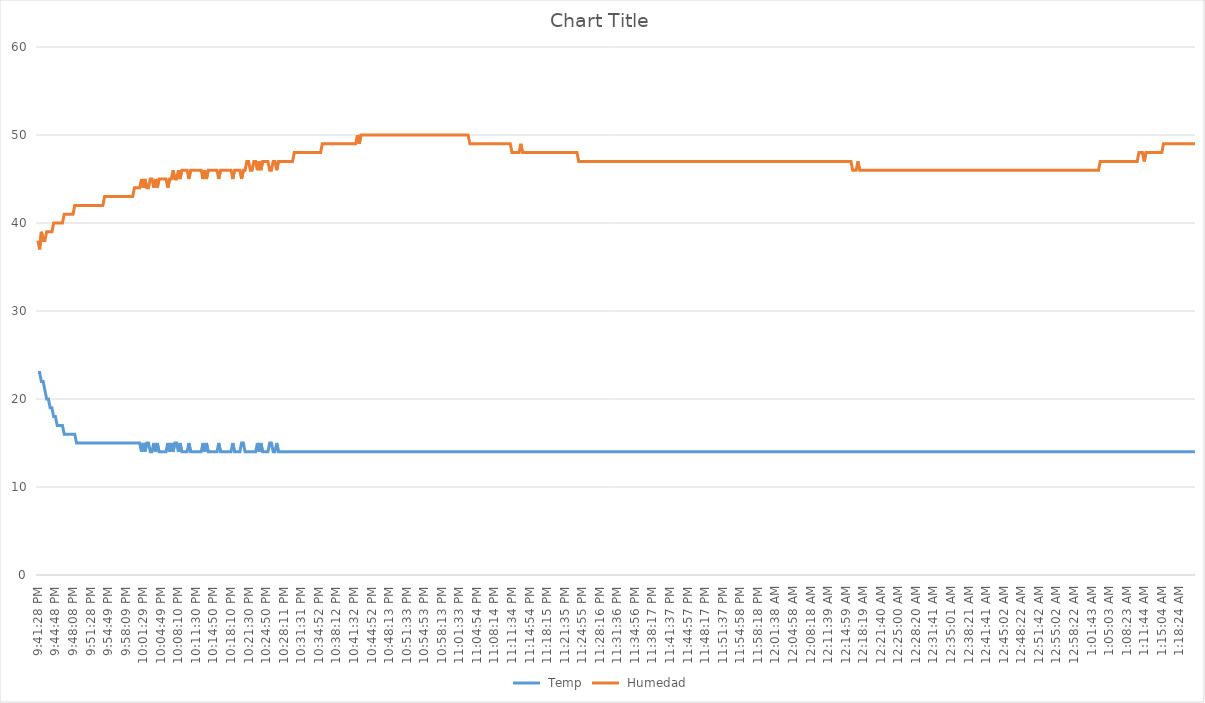
| Category |  Temp |  Humedad |
|---|---|---|
| 2015-11-24 21:41:28 | 23 | 38 |
| 2015-11-24 21:41:48 | 23 | 37 |
| 2015-11-24 21:42:08 | 22 | 39 |
| 2015-11-24 21:42:28 | 22 | 38 |
| 2015-11-24 21:42:48 | 21 | 38 |
| 2015-11-24 21:43:08 | 20 | 39 |
| 2015-11-24 21:43:28 | 20 | 39 |
| 2015-11-24 21:43:48 | 19 | 39 |
| 2015-11-24 21:44:08 | 19 | 39 |
| 2015-11-24 21:44:28 | 18 | 40 |
| 2015-11-24 21:44:48 | 18 | 40 |
| 2015-11-24 21:45:08 | 17 | 40 |
| 2015-11-24 21:45:28 | 17 | 40 |
| 2015-11-24 21:45:48 | 17 | 40 |
| 2015-11-24 21:46:08 | 17 | 40 |
| 2015-11-24 21:46:28 | 16 | 41 |
| 2015-11-24 21:46:48 | 16 | 41 |
| 2015-11-24 21:47:08 | 16 | 41 |
| 2015-11-24 21:47:28 | 16 | 41 |
| 2015-11-24 21:47:48 | 16 | 41 |
| 2015-11-24 21:48:08 | 16 | 41 |
| 2015-11-24 21:48:28 | 16 | 42 |
| 2015-11-24 21:48:48 | 15 | 42 |
| 2015-11-24 21:49:08 | 15 | 42 |
| 2015-11-24 21:49:28 | 15 | 42 |
| 2015-11-24 21:49:48 | 15 | 42 |
| 2015-11-24 21:50:08 | 15 | 42 |
| 2015-11-24 21:50:28 | 15 | 42 |
| 2015-11-24 21:50:48 | 15 | 42 |
| 2015-11-24 21:51:08 | 15 | 42 |
| 2015-11-24 21:51:28 | 15 | 42 |
| 2015-11-24 21:51:48 | 15 | 42 |
| 2015-11-24 21:52:08 | 15 | 42 |
| 2015-11-24 21:52:28 | 15 | 42 |
| 2015-11-24 21:52:48 | 15 | 42 |
| 2015-11-24 21:53:08 | 15 | 42 |
| 2015-11-24 21:53:28 | 15 | 42 |
| 2015-11-24 21:53:48 | 15 | 42 |
| 2015-11-24 21:54:08 | 15 | 43 |
| 2015-11-24 21:54:28 | 15 | 43 |
| 2015-11-24 21:54:49 | 15 | 43 |
| 2015-11-24 21:55:09 | 15 | 43 |
| 2015-11-24 21:55:29 | 15 | 43 |
| 2015-11-24 21:55:49 | 15 | 43 |
| 2015-11-24 21:56:09 | 15 | 43 |
| 2015-11-24 21:56:29 | 15 | 43 |
| 2015-11-24 21:56:49 | 15 | 43 |
| 2015-11-24 21:57:09 | 15 | 43 |
| 2015-11-24 21:57:29 | 15 | 43 |
| 2015-11-24 21:57:49 | 15 | 43 |
| 2015-11-24 21:58:09 | 15 | 43 |
| 2015-11-24 21:58:29 | 15 | 43 |
| 2015-11-24 21:58:49 | 15 | 43 |
| 2015-11-24 21:59:09 | 15 | 43 |
| 2015-11-24 21:59:29 | 15 | 43 |
| 2015-11-24 21:59:49 | 15 | 44 |
| 2015-11-24 22:00:09 | 15 | 44 |
| 2015-11-24 22:00:29 | 15 | 44 |
| 2015-11-24 22:00:49 | 15 | 44 |
| 2015-11-24 22:01:09 | 14 | 45 |
| 2015-11-24 22:01:29 | 15 | 44 |
| 2015-11-24 22:01:49 | 14 | 45 |
| 2015-11-24 22:02:09 | 15 | 44 |
| 2015-11-24 22:02:29 | 15 | 44 |
| 2015-11-24 22:02:49 | 14 | 45 |
| 2015-11-24 22:03:09 | 14 | 45 |
| 2015-11-24 22:03:29 | 15 | 44 |
| 2015-11-24 22:03:49 | 14 | 45 |
| 2015-11-24 22:04:09 | 15 | 44 |
| 2015-11-24 22:04:29 | 14 | 45 |
| 2015-11-24 22:04:49 | 14 | 45 |
| 2015-11-24 22:05:09 | 14 | 45 |
| 2015-11-24 22:05:29 | 14 | 45 |
| 2015-11-24 22:05:49 | 14 | 45 |
| 2015-11-24 22:06:09 | 15 | 44 |
| 2015-11-24 22:06:29 | 14 | 45 |
| 2015-11-24 22:06:49 | 15 | 45 |
| 2015-11-24 22:07:09 | 14 | 46 |
| 2015-11-24 22:07:30 | 15 | 45 |
| 2015-11-24 22:07:50 | 15 | 45 |
| 2015-11-24 22:08:10 | 14 | 46 |
| 2015-11-24 22:08:30 | 15 | 45 |
| 2015-11-24 22:08:50 | 14 | 46 |
| 2015-11-24 22:09:10 | 14 | 46 |
| 2015-11-24 22:09:30 | 14 | 46 |
| 2015-11-24 22:09:50 | 14 | 46 |
| 2015-11-24 22:10:10 | 15 | 45 |
| 2015-11-24 22:10:30 | 14 | 46 |
| 2015-11-24 22:10:50 | 14 | 46 |
| 2015-11-24 22:11:10 | 14 | 46 |
| 2015-11-24 22:11:30 | 14 | 46 |
| 2015-11-24 22:11:50 | 14 | 46 |
| 2015-11-24 22:12:10 | 14 | 46 |
| 2015-11-24 22:12:30 | 14 | 46 |
| 2015-11-24 22:12:50 | 15 | 45 |
| 2015-11-24 22:13:10 | 14 | 46 |
| 2015-11-24 22:13:30 | 15 | 45 |
| 2015-11-24 22:13:50 | 14 | 46 |
| 2015-11-24 22:14:10 | 14 | 46 |
| 2015-11-24 22:14:30 | 14 | 46 |
| 2015-11-24 22:14:50 | 14 | 46 |
| 2015-11-24 22:15:10 | 14 | 46 |
| 2015-11-24 22:15:30 | 14 | 46 |
| 2015-11-24 22:15:50 | 15 | 45 |
| 2015-11-24 22:16:10 | 14 | 46 |
| 2015-11-24 22:16:30 | 14 | 46 |
| 2015-11-24 22:16:50 | 14 | 46 |
| 2015-11-24 22:17:10 | 14 | 46 |
| 2015-11-24 22:17:30 | 14 | 46 |
| 2015-11-24 22:17:50 | 14 | 46 |
| 2015-11-24 22:18:10 | 14 | 46 |
| 2015-11-24 22:18:30 | 15 | 45 |
| 2015-11-24 22:18:50 | 14 | 46 |
| 2015-11-24 22:19:10 | 14 | 46 |
| 2015-11-24 22:19:30 | 14 | 46 |
| 2015-11-24 22:19:50 | 14 | 46 |
| 2015-11-24 22:20:10 | 15 | 45 |
| 2015-11-24 22:20:30 | 15 | 46 |
| 2015-11-24 22:20:50 | 14 | 46 |
| 2015-11-24 22:21:10 | 14 | 47 |
| 2015-11-24 22:21:30 | 14 | 47 |
| 2015-11-24 22:21:50 | 14 | 46 |
| 2015-11-24 22:22:10 | 14 | 46 |
| 2015-11-24 22:22:30 | 14 | 47 |
| 2015-11-24 22:22:50 | 14 | 47 |
| 2015-11-24 22:23:10 | 15 | 46 |
| 2015-11-24 22:23:30 | 14 | 47 |
| 2015-11-24 22:23:50 | 15 | 46 |
| 2015-11-24 22:24:10 | 14 | 47 |
| 2015-11-24 22:24:30 | 14 | 47 |
| 2015-11-24 22:24:50 | 14 | 47 |
| 2015-11-24 22:25:10 | 14 | 47 |
| 2015-11-24 22:25:31 | 15 | 46 |
| 2015-11-24 22:25:51 | 15 | 46 |
| 2015-11-24 22:26:11 | 14 | 47 |
| 2015-11-24 22:26:31 | 14 | 47 |
| 2015-11-24 22:26:51 | 15 | 46 |
| 2015-11-24 22:27:11 | 14 | 47 |
| 2015-11-24 22:27:31 | 14 | 47 |
| 2015-11-24 22:27:51 | 14 | 47 |
| 2015-11-24 22:28:11 | 14 | 47 |
| 2015-11-24 22:28:31 | 14 | 47 |
| 2015-11-24 22:28:51 | 14 | 47 |
| 2015-11-24 22:29:11 | 14 | 47 |
| 2015-11-24 22:29:31 | 14 | 47 |
| 2015-11-24 22:29:51 | 14 | 47 |
| 2015-11-24 22:30:11 | 14 | 48 |
| 2015-11-24 22:30:31 | 14 | 48 |
| 2015-11-24 22:30:51 | 14 | 48 |
| 2015-11-24 22:31:11 | 14 | 48 |
| 2015-11-24 22:31:31 | 14 | 48 |
| 2015-11-24 22:31:51 | 14 | 48 |
| 2015-11-24 22:32:11 | 14 | 48 |
| 2015-11-24 22:32:31 | 14 | 48 |
| 2015-11-24 22:32:51 | 14 | 48 |
| 2015-11-24 22:33:11 | 14 | 48 |
| 2015-11-24 22:33:31 | 14 | 48 |
| 2015-11-24 22:33:52 | 14 | 48 |
| 2015-11-24 22:34:12 | 14 | 48 |
| 2015-11-24 22:34:32 | 14 | 48 |
| 2015-11-24 22:34:52 | 14 | 48 |
| 2015-11-24 22:35:12 | 14 | 48 |
| 2015-11-24 22:35:32 | 14 | 49 |
| 2015-11-24 22:35:52 | 14 | 49 |
| 2015-11-24 22:36:12 | 14 | 49 |
| 2015-11-24 22:36:32 | 14 | 49 |
| 2015-11-24 22:36:52 | 14 | 49 |
| 2015-11-24 22:37:12 | 14 | 49 |
| 2015-11-24 22:37:32 | 14 | 49 |
| 2015-11-24 22:37:52 | 14 | 49 |
| 2015-11-24 22:38:12 | 14 | 49 |
| 2015-11-24 22:38:32 | 14 | 49 |
| 2015-11-24 22:38:52 | 14 | 49 |
| 2015-11-24 22:39:12 | 14 | 49 |
| 2015-11-24 22:39:32 | 14 | 49 |
| 2015-11-24 22:39:52 | 14 | 49 |
| 2015-11-24 22:40:12 | 14 | 49 |
| 2015-11-24 22:40:32 | 14 | 49 |
| 2015-11-24 22:40:52 | 14 | 49 |
| 2015-11-24 22:41:12 | 14 | 49 |
| 2015-11-24 22:41:32 | 14 | 49 |
| 2015-11-24 22:41:52 | 14 | 49 |
| 2015-11-24 22:42:12 | 14 | 50 |
| 2015-11-24 22:42:32 | 14 | 49 |
| 2015-11-24 22:42:52 | 14 | 50 |
| 2015-11-24 22:43:12 | 14 | 50 |
| 2015-11-24 22:43:32 | 14 | 50 |
| 2015-11-24 22:43:52 | 14 | 50 |
| 2015-11-24 22:44:12 | 14 | 50 |
| 2015-11-24 22:44:32 | 14 | 50 |
| 2015-11-24 22:44:52 | 14 | 50 |
| 2015-11-24 22:45:12 | 14 | 50 |
| 2015-11-24 22:45:32 | 14 | 50 |
| 2015-11-24 22:45:52 | 14 | 50 |
| 2015-11-24 22:46:12 | 14 | 50 |
| 2015-11-24 22:46:32 | 14 | 50 |
| 2015-11-24 22:46:52 | 14 | 50 |
| 2015-11-24 22:47:12 | 14 | 50 |
| 2015-11-24 22:47:33 | 14 | 50 |
| 2015-11-24 22:47:53 | 14 | 50 |
| 2015-11-24 22:48:13 | 14 | 50 |
| 2015-11-24 22:48:33 | 14 | 50 |
| 2015-11-24 22:48:53 | 14 | 50 |
| 2015-11-24 22:49:13 | 14 | 50 |
| 2015-11-24 22:49:33 | 14 | 50 |
| 2015-11-24 22:49:53 | 14 | 50 |
| 2015-11-24 22:50:13 | 14 | 50 |
| 2015-11-24 22:50:33 | 14 | 50 |
| 2015-11-24 22:50:53 | 14 | 50 |
| 2015-11-24 22:51:13 | 14 | 50 |
| 2015-11-24 22:51:33 | 14 | 50 |
| 2015-11-24 22:51:53 | 14 | 50 |
| 2015-11-24 22:52:13 | 14 | 50 |
| 2015-11-24 22:52:33 | 14 | 50 |
| 2015-11-24 22:52:53 | 14 | 50 |
| 2015-11-24 22:53:13 | 14 | 50 |
| 2015-11-24 22:53:33 | 14 | 50 |
| 2015-11-24 22:53:53 | 14 | 50 |
| 2015-11-24 22:54:13 | 14 | 50 |
| 2015-11-24 22:54:33 | 14 | 50 |
| 2015-11-24 22:54:53 | 14 | 50 |
| 2015-11-24 22:55:13 | 14 | 50 |
| 2015-11-24 22:55:33 | 14 | 50 |
| 2015-11-24 22:55:53 | 14 | 50 |
| 2015-11-24 22:56:13 | 14 | 50 |
| 2015-11-24 22:56:33 | 14 | 50 |
| 2015-11-24 22:56:53 | 14 | 50 |
| 2015-11-24 22:57:13 | 14 | 50 |
| 2015-11-24 22:57:33 | 14 | 50 |
| 2015-11-24 22:57:53 | 14 | 50 |
| 2015-11-24 22:58:13 | 14 | 50 |
| 2015-11-24 22:58:33 | 14 | 50 |
| 2015-11-24 22:58:53 | 14 | 50 |
| 2015-11-24 22:59:13 | 14 | 50 |
| 2015-11-24 22:59:33 | 14 | 50 |
| 2015-11-24 22:59:53 | 14 | 50 |
| 2015-11-24 23:00:13 | 14 | 50 |
| 2015-11-24 23:00:33 | 14 | 50 |
| 2015-11-24 23:00:53 | 14 | 50 |
| 2015-11-24 23:01:13 | 14 | 50 |
| 2015-11-24 23:01:33 | 14 | 50 |
| 2015-11-24 23:01:53 | 14 | 50 |
| 2015-11-24 23:02:14 | 14 | 50 |
| 2015-11-24 23:02:34 | 14 | 50 |
| 2015-11-24 23:02:54 | 14 | 50 |
| 2015-11-24 23:03:14 | 14 | 50 |
| 2015-11-24 23:03:34 | 14 | 49 |
| 2015-11-24 23:03:54 | 14 | 49 |
| 2015-11-24 23:04:14 | 14 | 49 |
| 2015-11-24 23:04:34 | 14 | 49 |
| 2015-11-24 23:04:54 | 14 | 49 |
| 2015-11-24 23:05:14 | 14 | 49 |
| 2015-11-24 23:05:34 | 14 | 49 |
| 2015-11-24 23:05:54 | 14 | 49 |
| 2015-11-24 23:06:14 | 14 | 49 |
| 2015-11-24 23:06:34 | 14 | 49 |
| 2015-11-24 23:06:54 | 14 | 49 |
| 2015-11-24 23:07:14 | 14 | 49 |
| 2015-11-24 23:07:34 | 14 | 49 |
| 2015-11-24 23:07:54 | 14 | 49 |
| 2015-11-24 23:08:14 | 14 | 49 |
| 2015-11-24 23:08:34 | 14 | 49 |
| 2015-11-24 23:08:54 | 14 | 49 |
| 2015-11-24 23:09:14 | 14 | 49 |
| 2015-11-24 23:09:34 | 14 | 49 |
| 2015-11-24 23:09:54 | 14 | 49 |
| 2015-11-24 23:10:14 | 14 | 49 |
| 2015-11-24 23:10:34 | 14 | 49 |
| 2015-11-24 23:10:54 | 14 | 49 |
| 2015-11-24 23:11:14 | 14 | 49 |
| 2015-11-24 23:11:34 | 14 | 48 |
| 2015-11-24 23:11:54 | 14 | 48 |
| 2015-11-24 23:12:14 | 14 | 48 |
| 2015-11-24 23:12:34 | 14 | 48 |
| 2015-11-24 23:12:54 | 14 | 48 |
| 2015-11-24 23:13:14 | 14 | 49 |
| 2015-11-24 23:13:34 | 14 | 48 |
| 2015-11-24 23:13:54 | 14 | 48 |
| 2015-11-24 23:14:14 | 14 | 48 |
| 2015-11-24 23:14:34 | 14 | 48 |
| 2015-11-24 23:14:54 | 14 | 48 |
| 2015-11-24 23:15:15 | 14 | 48 |
| 2015-11-24 23:15:35 | 14 | 48 |
| 2015-11-24 23:15:55 | 14 | 48 |
| 2015-11-24 23:16:15 | 14 | 48 |
| 2015-11-24 23:16:35 | 14 | 48 |
| 2015-11-24 23:16:55 | 14 | 48 |
| 2015-11-24 23:17:15 | 14 | 48 |
| 2015-11-24 23:17:35 | 14 | 48 |
| 2015-11-24 23:17:55 | 14 | 48 |
| 2015-11-24 23:18:15 | 14 | 48 |
| 2015-11-24 23:18:35 | 14 | 48 |
| 2015-11-24 23:18:55 | 14 | 48 |
| 2015-11-24 23:19:15 | 14 | 48 |
| 2015-11-24 23:19:35 | 14 | 48 |
| 2015-11-24 23:19:55 | 14 | 48 |
| 2015-11-24 23:20:15 | 14 | 48 |
| 2015-11-24 23:20:35 | 14 | 48 |
| 2015-11-24 23:20:55 | 14 | 48 |
| 2015-11-24 23:21:15 | 14 | 48 |
| 2015-11-24 23:21:35 | 14 | 48 |
| 2015-11-24 23:21:55 | 14 | 48 |
| 2015-11-24 23:22:15 | 14 | 48 |
| 2015-11-24 23:22:35 | 14 | 48 |
| 2015-11-24 23:22:55 | 14 | 48 |
| 2015-11-24 23:23:15 | 14 | 48 |
| 2015-11-24 23:23:35 | 14 | 48 |
| 2015-11-24 23:23:55 | 14 | 48 |
| 2015-11-24 23:24:15 | 14 | 47 |
| 2015-11-24 23:24:35 | 14 | 47 |
| 2015-11-24 23:24:55 | 14 | 47 |
| 2015-11-24 23:25:15 | 14 | 47 |
| 2015-11-24 23:25:35 | 14 | 47 |
| 2015-11-24 23:25:55 | 14 | 47 |
| 2015-11-24 23:26:15 | 14 | 47 |
| 2015-11-24 23:26:35 | 14 | 47 |
| 2015-11-24 23:26:55 | 14 | 47 |
| 2015-11-24 23:27:15 | 14 | 47 |
| 2015-11-24 23:27:35 | 14 | 47 |
| 2015-11-24 23:27:56 | 14 | 47 |
| 2015-11-24 23:28:16 | 14 | 47 |
| 2015-11-24 23:28:36 | 14 | 47 |
| 2015-11-24 23:28:56 | 14 | 47 |
| 2015-11-24 23:29:16 | 14 | 47 |
| 2015-11-24 23:29:36 | 14 | 47 |
| 2015-11-24 23:29:56 | 14 | 47 |
| 2015-11-24 23:30:16 | 14 | 47 |
| 2015-11-24 23:30:36 | 14 | 47 |
| 2015-11-24 23:30:56 | 14 | 47 |
| 2015-11-24 23:31:16 | 14 | 47 |
| 2015-11-24 23:31:36 | 14 | 47 |
| 2015-11-24 23:31:56 | 14 | 47 |
| 2015-11-24 23:32:16 | 14 | 47 |
| 2015-11-24 23:32:36 | 14 | 47 |
| 2015-11-24 23:32:56 | 14 | 47 |
| 2015-11-24 23:33:16 | 14 | 47 |
| 2015-11-24 23:33:36 | 14 | 47 |
| 2015-11-24 23:33:56 | 14 | 47 |
| 2015-11-24 23:34:16 | 14 | 47 |
| 2015-11-24 23:34:36 | 14 | 47 |
| 2015-11-24 23:34:56 | 14 | 47 |
| 2015-11-24 23:35:16 | 14 | 47 |
| 2015-11-24 23:35:36 | 14 | 47 |
| 2015-11-24 23:35:56 | 14 | 47 |
| 2015-11-24 23:36:16 | 14 | 47 |
| 2015-11-24 23:36:36 | 14 | 47 |
| 2015-11-24 23:36:56 | 14 | 47 |
| 2015-11-24 23:37:16 | 14 | 47 |
| 2015-11-24 23:37:36 | 14 | 47 |
| 2015-11-24 23:37:57 | 14 | 47 |
| 2015-11-24 23:38:17 | 14 | 47 |
| 2015-11-24 23:38:37 | 14 | 47 |
| 2015-11-24 23:38:57 | 14 | 47 |
| 2015-11-24 23:39:17 | 14 | 47 |
| 2015-11-24 23:39:37 | 14 | 47 |
| 2015-11-24 23:39:57 | 14 | 47 |
| 2015-11-24 23:40:17 | 14 | 47 |
| 2015-11-24 23:40:37 | 14 | 47 |
| 2015-11-24 23:40:57 | 14 | 47 |
| 2015-11-24 23:41:17 | 14 | 47 |
| 2015-11-24 23:41:37 | 14 | 47 |
| 2015-11-24 23:41:57 | 14 | 47 |
| 2015-11-24 23:42:17 | 14 | 47 |
| 2015-11-24 23:42:37 | 14 | 47 |
| 2015-11-24 23:42:57 | 14 | 47 |
| 2015-11-24 23:43:17 | 14 | 47 |
| 2015-11-24 23:43:37 | 14 | 47 |
| 2015-11-24 23:43:57 | 14 | 47 |
| 2015-11-24 23:44:17 | 14 | 47 |
| 2015-11-24 23:44:37 | 14 | 47 |
| 2015-11-24 23:44:57 | 14 | 47 |
| 2015-11-24 23:45:17 | 14 | 47 |
| 2015-11-24 23:45:37 | 14 | 47 |
| 2015-11-24 23:45:57 | 14 | 47 |
| 2015-11-24 23:46:17 | 14 | 47 |
| 2015-11-24 23:46:37 | 14 | 47 |
| 2015-11-24 23:46:57 | 14 | 47 |
| 2015-11-24 23:47:17 | 14 | 47 |
| 2015-11-24 23:47:37 | 14 | 47 |
| 2015-11-24 23:47:57 | 14 | 47 |
| 2015-11-24 23:48:17 | 14 | 47 |
| 2015-11-24 23:48:37 | 14 | 47 |
| 2015-11-24 23:48:57 | 14 | 47 |
| 2015-11-24 23:49:17 | 14 | 47 |
| 2015-11-24 23:49:37 | 14 | 47 |
| 2015-11-24 23:49:57 | 14 | 47 |
| 2015-11-24 23:50:17 | 14 | 47 |
| 2015-11-24 23:50:37 | 14 | 47 |
| 2015-11-24 23:50:57 | 14 | 47 |
| 2015-11-24 23:51:17 | 14 | 47 |
| 2015-11-24 23:51:37 | 14 | 47 |
| 2015-11-24 23:51:57 | 14 | 47 |
| 2015-11-24 23:52:17 | 14 | 47 |
| 2015-11-24 23:52:37 | 14 | 47 |
| 2015-11-24 23:52:57 | 14 | 47 |
| 2015-11-24 23:53:17 | 14 | 47 |
| 2015-11-24 23:53:38 | 14 | 47 |
| 2015-11-24 23:53:58 | 14 | 47 |
| 2015-11-24 23:54:18 | 14 | 47 |
| 2015-11-24 23:54:38 | 14 | 47 |
| 2015-11-24 23:54:58 | 14 | 47 |
| 2015-11-24 23:55:18 | 14 | 47 |
| 2015-11-24 23:55:38 | 14 | 47 |
| 2015-11-24 23:55:58 | 14 | 47 |
| 2015-11-24 23:56:18 | 14 | 47 |
| 2015-11-24 23:56:38 | 14 | 47 |
| 2015-11-24 23:56:58 | 14 | 47 |
| 2015-11-24 23:57:18 | 14 | 47 |
| 2015-11-24 23:57:38 | 14 | 47 |
| 2015-11-24 23:57:58 | 14 | 47 |
| 2015-11-24 23:58:18 | 14 | 47 |
| 2015-11-24 23:58:38 | 14 | 47 |
| 2015-11-24 23:58:58 | 14 | 47 |
| 2015-11-24 23:59:18 | 14 | 47 |
| 2015-11-24 23:59:38 | 14 | 47 |
| 2015-11-24 23:59:58 | 14 | 47 |
| 2015-11-25 00:00:18 | 14 | 47 |
| 2015-11-25 00:00:38 | 14 | 47 |
| 2015-11-25 00:00:58 | 14 | 47 |
| 2015-11-25 00:01:18 | 14 | 47 |
| 2015-11-25 00:01:38 | 14 | 47 |
| 2015-11-25 00:01:58 | 14 | 47 |
| 2015-11-25 00:02:18 | 14 | 47 |
| 2015-11-25 00:02:38 | 14 | 47 |
| 2015-11-25 00:02:58 | 14 | 47 |
| 2015-11-25 00:03:18 | 14 | 47 |
| 2015-11-25 00:03:38 | 14 | 47 |
| 2015-11-25 00:03:58 | 14 | 47 |
| 2015-11-25 00:04:18 | 14 | 47 |
| 2015-11-25 00:04:38 | 14 | 47 |
| 2015-11-25 00:04:58 | 14 | 47 |
| 2015-11-25 00:05:18 | 14 | 47 |
| 2015-11-25 00:05:38 | 14 | 47 |
| 2015-11-25 00:05:58 | 14 | 47 |
| 2015-11-25 00:06:18 | 14 | 47 |
| 2015-11-25 00:06:38 | 14 | 47 |
| 2015-11-25 00:06:58 | 14 | 47 |
| 2015-11-25 00:07:18 | 14 | 47 |
| 2015-11-25 00:07:38 | 14 | 47 |
| 2015-11-25 00:07:58 | 14 | 47 |
| 2015-11-25 00:08:18 | 14 | 47 |
| 2015-11-25 00:08:38 | 14 | 47 |
| 2015-11-25 00:08:59 | 14 | 47 |
| 2015-11-25 00:09:19 | 14 | 47 |
| 2015-11-25 00:09:39 | 14 | 47 |
| 2015-11-25 00:09:59 | 14 | 47 |
| 2015-11-25 00:10:19 | 14 | 47 |
| 2015-11-25 00:10:39 | 14 | 47 |
| 2015-11-25 00:10:59 | 14 | 47 |
| 2015-11-25 00:11:19 | 14 | 47 |
| 2015-11-25 00:11:39 | 14 | 47 |
| 2015-11-25 00:11:59 | 14 | 47 |
| 2015-11-25 00:12:19 | 14 | 47 |
| 2015-11-25 00:12:39 | 14 | 47 |
| 2015-11-25 00:12:59 | 14 | 47 |
| 2015-11-25 00:13:19 | 14 | 47 |
| 2015-11-25 00:13:39 | 14 | 47 |
| 2015-11-25 00:13:59 | 14 | 47 |
| 2015-11-25 00:14:19 | 14 | 47 |
| 2015-11-25 00:14:39 | 14 | 47 |
| 2015-11-25 00:14:59 | 14 | 47 |
| 2015-11-25 00:15:19 | 14 | 47 |
| 2015-11-25 00:15:39 | 14 | 47 |
| 2015-11-25 00:15:59 | 14 | 47 |
| 2015-11-25 00:16:19 | 14 | 46 |
| 2015-11-25 00:16:39 | 14 | 46 |
| 2015-11-25 00:16:59 | 14 | 46 |
| 2015-11-25 00:17:19 | 14 | 47 |
| 2015-11-25 00:17:39 | 14 | 46 |
| 2015-11-25 00:17:59 | 14 | 46 |
| 2015-11-25 00:18:19 | 14 | 46 |
| 2015-11-25 00:18:39 | 14 | 46 |
| 2015-11-25 00:19:00 | 14 | 46 |
| 2015-11-25 00:19:20 | 14 | 46 |
| 2015-11-25 00:19:40 | 14 | 46 |
| 2015-11-25 00:20:00 | 14 | 46 |
| 2015-11-25 00:20:20 | 14 | 46 |
| 2015-11-25 00:20:40 | 14 | 46 |
| 2015-11-25 00:21:00 | 14 | 46 |
| 2015-11-25 00:21:20 | 14 | 46 |
| 2015-11-25 00:21:40 | 14 | 46 |
| 2015-11-25 00:22:00 | 14 | 46 |
| 2015-11-25 00:22:20 | 14 | 46 |
| 2015-11-25 00:22:40 | 14 | 46 |
| 2015-11-25 00:23:00 | 14 | 46 |
| 2015-11-25 00:23:20 | 14 | 46 |
| 2015-11-25 00:23:40 | 14 | 46 |
| 2015-11-25 00:24:00 | 14 | 46 |
| 2015-11-25 00:24:20 | 14 | 46 |
| 2015-11-25 00:24:40 | 14 | 46 |
| 2015-11-25 00:25:00 | 14 | 46 |
| 2015-11-25 00:25:20 | 14 | 46 |
| 2015-11-25 00:25:40 | 14 | 46 |
| 2015-11-25 00:26:00 | 14 | 46 |
| 2015-11-25 00:26:20 | 14 | 46 |
| 2015-11-25 00:26:40 | 14 | 46 |
| 2015-11-25 00:27:00 | 14 | 46 |
| 2015-11-25 00:27:20 | 14 | 46 |
| 2015-11-25 00:27:40 | 14 | 46 |
| 2015-11-25 00:28:00 | 14 | 46 |
| 2015-11-25 00:28:20 | 14 | 46 |
| 2015-11-25 00:28:40 | 14 | 46 |
| 2015-11-25 00:29:00 | 14 | 46 |
| 2015-11-25 00:29:20 | 14 | 46 |
| 2015-11-25 00:29:40 | 14 | 46 |
| 2015-11-25 00:30:00 | 14 | 46 |
| 2015-11-25 00:30:20 | 14 | 46 |
| 2015-11-25 00:30:40 | 14 | 46 |
| 2015-11-25 00:31:00 | 14 | 46 |
| 2015-11-25 00:31:21 | 14 | 46 |
| 2015-11-25 00:31:41 | 14 | 46 |
| 2015-11-25 00:32:01 | 14 | 46 |
| 2015-11-25 00:32:21 | 14 | 46 |
| 2015-11-25 00:32:41 | 14 | 46 |
| 2015-11-25 00:33:01 | 14 | 46 |
| 2015-11-25 00:33:21 | 14 | 46 |
| 2015-11-25 00:33:41 | 14 | 46 |
| 2015-11-25 00:34:01 | 14 | 46 |
| 2015-11-25 00:34:21 | 14 | 46 |
| 2015-11-25 00:34:41 | 14 | 46 |
| 2015-11-25 00:35:01 | 14 | 46 |
| 2015-11-25 00:35:21 | 14 | 46 |
| 2015-11-25 00:35:41 | 14 | 46 |
| 2015-11-25 00:36:01 | 14 | 46 |
| 2015-11-25 00:36:21 | 14 | 46 |
| 2015-11-25 00:36:41 | 14 | 46 |
| 2015-11-25 00:37:01 | 14 | 46 |
| 2015-11-25 00:37:21 | 14 | 46 |
| 2015-11-25 00:37:41 | 14 | 46 |
| 2015-11-25 00:38:01 | 14 | 46 |
| 2015-11-25 00:38:21 | 14 | 46 |
| 2015-11-25 00:38:41 | 14 | 46 |
| 2015-11-25 00:39:01 | 14 | 46 |
| 2015-11-25 00:39:21 | 14 | 46 |
| 2015-11-25 00:39:41 | 14 | 46 |
| 2015-11-25 00:40:01 | 14 | 46 |
| 2015-11-25 00:40:21 | 14 | 46 |
| 2015-11-25 00:40:41 | 14 | 46 |
| 2015-11-25 00:41:01 | 14 | 46 |
| 2015-11-25 00:41:21 | 14 | 46 |
| 2015-11-25 00:41:41 | 14 | 46 |
| 2015-11-25 00:42:01 | 14 | 46 |
| 2015-11-25 00:42:21 | 14 | 46 |
| 2015-11-25 00:42:41 | 14 | 46 |
| 2015-11-25 00:43:01 | 14 | 46 |
| 2015-11-25 00:43:21 | 14 | 46 |
| 2015-11-25 00:43:42 | 14 | 46 |
| 2015-11-25 00:44:02 | 14 | 46 |
| 2015-11-25 00:44:22 | 14 | 46 |
| 2015-11-25 00:44:42 | 14 | 46 |
| 2015-11-25 00:45:02 | 14 | 46 |
| 2015-11-25 00:45:22 | 14 | 46 |
| 2015-11-25 00:45:42 | 14 | 46 |
| 2015-11-25 00:46:02 | 14 | 46 |
| 2015-11-25 00:46:22 | 14 | 46 |
| 2015-11-25 00:46:42 | 14 | 46 |
| 2015-11-25 00:47:02 | 14 | 46 |
| 2015-11-25 00:47:22 | 14 | 46 |
| 2015-11-25 00:47:42 | 14 | 46 |
| 2015-11-25 00:48:02 | 14 | 46 |
| 2015-11-25 00:48:22 | 14 | 46 |
| 2015-11-25 00:48:42 | 14 | 46 |
| 2015-11-25 00:49:02 | 14 | 46 |
| 2015-11-25 00:49:22 | 14 | 46 |
| 2015-11-25 00:49:42 | 14 | 46 |
| 2015-11-25 00:50:02 | 14 | 46 |
| 2015-11-25 00:50:22 | 14 | 46 |
| 2015-11-25 00:50:42 | 14 | 46 |
| 2015-11-25 00:51:02 | 14 | 46 |
| 2015-11-25 00:51:22 | 14 | 46 |
| 2015-11-25 00:51:42 | 14 | 46 |
| 2015-11-25 00:52:02 | 14 | 46 |
| 2015-11-25 00:52:22 | 14 | 46 |
| 2015-11-25 00:52:42 | 14 | 46 |
| 2015-11-25 00:53:02 | 14 | 46 |
| 2015-11-25 00:53:22 | 14 | 46 |
| 2015-11-25 00:53:42 | 14 | 46 |
| 2015-11-25 00:54:02 | 14 | 46 |
| 2015-11-25 00:54:22 | 14 | 46 |
| 2015-11-25 00:54:42 | 14 | 46 |
| 2015-11-25 00:55:02 | 14 | 46 |
| 2015-11-25 00:55:22 | 14 | 46 |
| 2015-11-25 00:55:42 | 14 | 46 |
| 2015-11-25 00:56:02 | 14 | 46 |
| 2015-11-25 00:56:22 | 14 | 46 |
| 2015-11-25 00:56:42 | 14 | 46 |
| 2015-11-25 00:57:02 | 14 | 46 |
| 2015-11-25 00:57:22 | 14 | 46 |
| 2015-11-25 00:57:42 | 14 | 46 |
| 2015-11-25 00:58:02 | 14 | 46 |
| 2015-11-25 00:58:22 | 14 | 46 |
| 2015-11-25 00:58:42 | 14 | 46 |
| 2015-11-25 00:59:02 | 14 | 46 |
| 2015-11-25 00:59:22 | 14 | 46 |
| 2015-11-25 00:59:43 | 14 | 46 |
| 2015-11-25 01:00:03 | 14 | 46 |
| 2015-11-25 01:00:23 | 14 | 46 |
| 2015-11-25 01:00:43 | 14 | 46 |
| 2015-11-25 01:01:03 | 14 | 46 |
| 2015-11-25 01:01:23 | 14 | 46 |
| 2015-11-25 01:01:43 | 14 | 46 |
| 2015-11-25 01:02:03 | 14 | 46 |
| 2015-11-25 01:02:23 | 14 | 46 |
| 2015-11-25 01:02:43 | 14 | 46 |
| 2015-11-25 01:03:03 | 14 | 46 |
| 2015-11-25 01:03:23 | 14 | 47 |
| 2015-11-25 01:03:43 | 14 | 47 |
| 2015-11-25 01:04:03 | 14 | 47 |
| 2015-11-25 01:04:23 | 14 | 47 |
| 2015-11-25 01:04:43 | 14 | 47 |
| 2015-11-25 01:05:03 | 14 | 47 |
| 2015-11-25 01:05:23 | 14 | 47 |
| 2015-11-25 01:05:43 | 14 | 47 |
| 2015-11-25 01:06:03 | 14 | 47 |
| 2015-11-25 01:06:23 | 14 | 47 |
| 2015-11-25 01:06:43 | 14 | 47 |
| 2015-11-25 01:07:03 | 14 | 47 |
| 2015-11-25 01:07:23 | 14 | 47 |
| 2015-11-25 01:07:43 | 14 | 47 |
| 2015-11-25 01:08:03 | 14 | 47 |
| 2015-11-25 01:08:23 | 14 | 47 |
| 2015-11-25 01:08:43 | 14 | 47 |
| 2015-11-25 01:09:03 | 14 | 47 |
| 2015-11-25 01:09:23 | 14 | 47 |
| 2015-11-25 01:09:43 | 14 | 47 |
| 2015-11-25 01:10:03 | 14 | 47 |
| 2015-11-25 01:10:23 | 14 | 47 |
| 2015-11-25 01:10:43 | 14 | 48 |
| 2015-11-25 01:11:03 | 14 | 48 |
| 2015-11-25 01:11:23 | 14 | 48 |
| 2015-11-25 01:11:44 | 14 | 47 |
| 2015-11-25 01:12:04 | 14 | 48 |
| 2015-11-25 01:12:24 | 14 | 48 |
| 2015-11-25 01:12:44 | 14 | 48 |
| 2015-11-25 01:13:04 | 14 | 48 |
| 2015-11-25 01:13:24 | 14 | 48 |
| 2015-11-25 01:13:44 | 14 | 48 |
| 2015-11-25 01:14:04 | 14 | 48 |
| 2015-11-25 01:14:24 | 14 | 48 |
| 2015-11-25 01:14:44 | 14 | 48 |
| 2015-11-25 01:15:04 | 14 | 48 |
| 2015-11-25 01:15:24 | 14 | 49 |
| 2015-11-25 01:15:44 | 14 | 49 |
| 2015-11-25 01:16:04 | 14 | 49 |
| 2015-11-25 01:16:24 | 14 | 49 |
| 2015-11-25 01:16:44 | 14 | 49 |
| 2015-11-25 01:17:04 | 14 | 49 |
| 2015-11-25 01:17:24 | 14 | 49 |
| 2015-11-25 01:17:44 | 14 | 49 |
| 2015-11-25 01:18:04 | 14 | 49 |
| 2015-11-25 01:18:24 | 14 | 49 |
| 2015-11-25 01:18:44 | 14 | 49 |
| 2015-11-25 01:19:04 | 14 | 49 |
| 2015-11-25 01:19:24 | 14 | 49 |
| 2015-11-25 01:19:44 | 14 | 49 |
| 2015-11-25 01:20:04 | 14 | 49 |
| 2015-11-25 01:20:24 | 14 | 49 |
| 2015-11-25 01:20:44 | 14 | 49 |
| 2015-11-25 01:21:04 | 14 | 49 |
| 2015-11-25 01:21:24 | 14 | 49 |